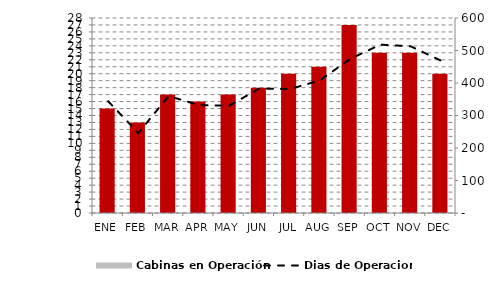
| Category | Cabinas en Operación |
|---|---|
| 0 | 15 |
| 1900-01-01 | 13 |
| 1900-01-02 | 17 |
| 1900-01-03 | 16 |
| 1900-01-04 | 17 |
| 1900-01-05 | 18 |
| 1900-01-06 | 20 |
| 1900-01-07 | 21 |
| 1900-01-08 | 27 |
| 1900-01-09 | 23 |
| 1900-01-10 | 23 |
| 1900-01-11 | 20 |